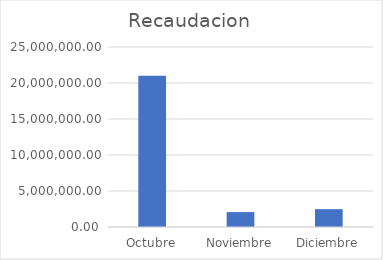
| Category | Recaudacion |
|---|---|
| Octubre | 21010454.5 |
| Noviembre | 2071369 |
| Diciembre | 2478477 |